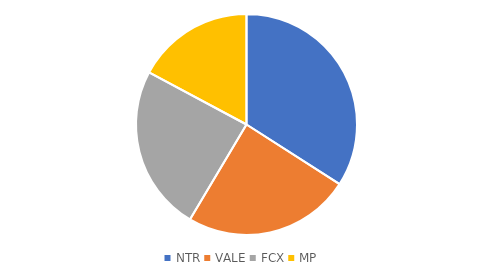
| Category | Series 0 |
|---|---|
| NTR | 8964 |
| VALE | 6444.75 |
| FCX | 6384.3 |
| MP | 4525.65 |